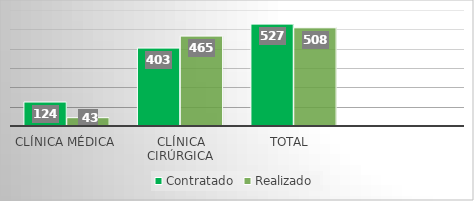
| Category | Contratado | Realizado |
|---|---|---|
| Clínica Médica | 124 | 43 |
| Clínica Cirúrgica | 403 | 465 |
| Total  | 527 | 508 |